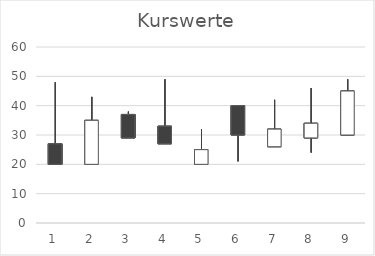
| Category | Eröffnung-
kurs | Höchst-
kurs | Tiefst-
kurs | Schluss-
kurs |
|---|---|---|---|---|
| 0 | 27 | 48 | 25 | 20 |
| 1 | 20 | 43 | 35 | 35 |
| 2 | 37 | 38 | 37 | 29 |
| 3 | 33 | 49 | 31 | 27 |
| 4 | 20 | 32 | 23 | 25 |
| 5 | 40 | 23 | 21 | 30 |
| 6 | 26 | 42 | 31 | 32 |
| 7 | 29 | 46 | 24 | 34 |
| 8 | 30 | 46 | 49 | 45 |